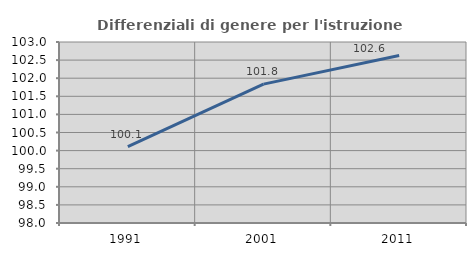
| Category | Differenziali di genere per l'istruzione superiore |
|---|---|
| 1991.0 | 100.108 |
| 2001.0 | 101.837 |
| 2011.0 | 102.626 |